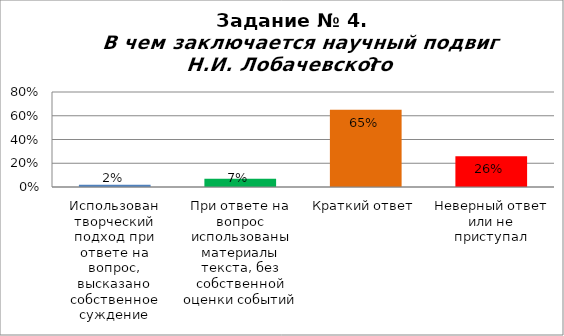
| Category | В чем заключается научный подвиг Н.И. Лобачевского? |
|---|---|
| Использован творческий подход при ответе на вопрос, высказано собственное суждение | 0.02 |
| При ответе на вопрос использованы материалы текста, без собственной оценки событий | 0.07 |
| Краткий ответ | 0.65 |
| Неверный ответ или не приступал | 0.26 |